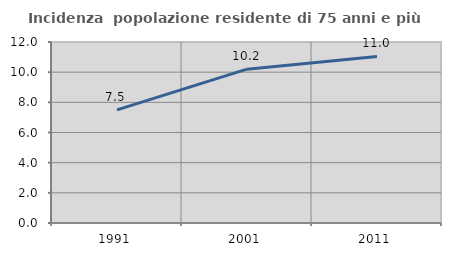
| Category | Incidenza  popolazione residente di 75 anni e più |
|---|---|
| 1991.0 | 7.496 |
| 2001.0 | 10.201 |
| 2011.0 | 11.041 |